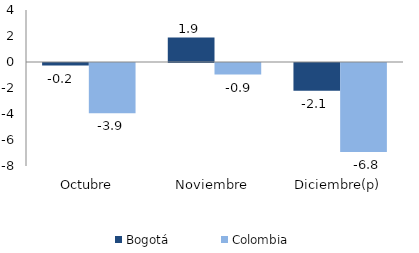
| Category | Bogotá | Colombia |
|---|---|---|
| Octubre | -0.198 | -3.874 |
| Noviembre | 1.881 | -0.89 |
| Diciembre(p) | -2.138 | -6.844 |